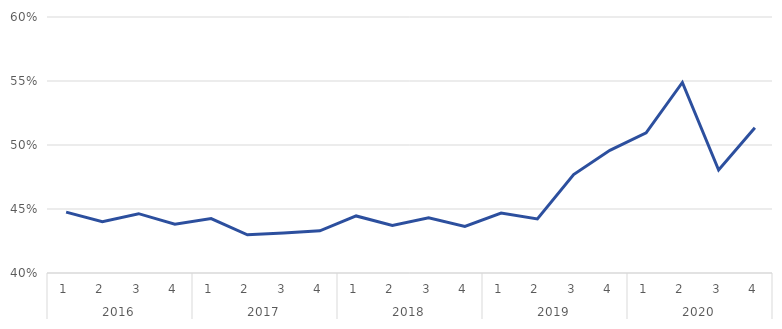
| Category | Part des VIF au sein des CBV |
|---|---|
| 0 | 0.448 |
| 1 | 0.44 |
| 2 | 0.446 |
| 3 | 0.438 |
| 4 | 0.442 |
| 5 | 0.43 |
| 6 | 0.431 |
| 7 | 0.433 |
| 8 | 0.445 |
| 9 | 0.437 |
| 10 | 0.443 |
| 11 | 0.436 |
| 12 | 0.447 |
| 13 | 0.442 |
| 14 | 0.477 |
| 15 | 0.496 |
| 16 | 0.509 |
| 17 | 0.549 |
| 18 | 0.48 |
| 19 | 0.513 |